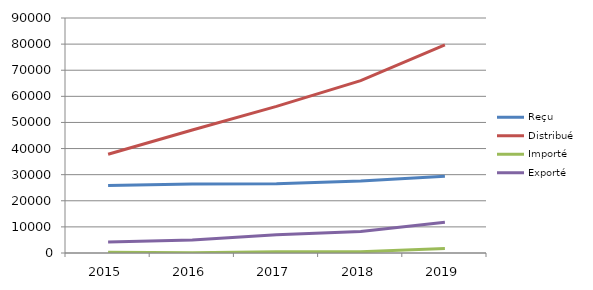
| Category | Reçu | Distribué | Importé | Exporté |
|---|---|---|---|---|
| 2015.0 | 25848 | 37843 | 297 | 4225 |
| 2016.0 | 26458 | 47106 | 126 | 4947 |
| 2017.0 | 26479 | 56155 | 433 | 7036 |
| 2018.0 | 27551 | 65999 | 498 | 8190 |
| 2019.0 | 29434 | 79730 | 1754 | 11792 |